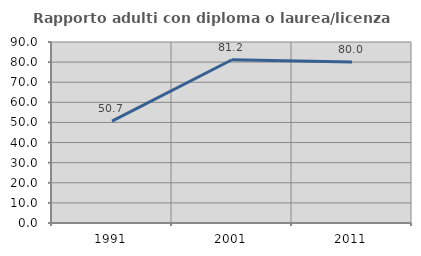
| Category | Rapporto adulti con diploma o laurea/licenza media  |
|---|---|
| 1991.0 | 50.663 |
| 2001.0 | 81.19 |
| 2011.0 | 80.032 |